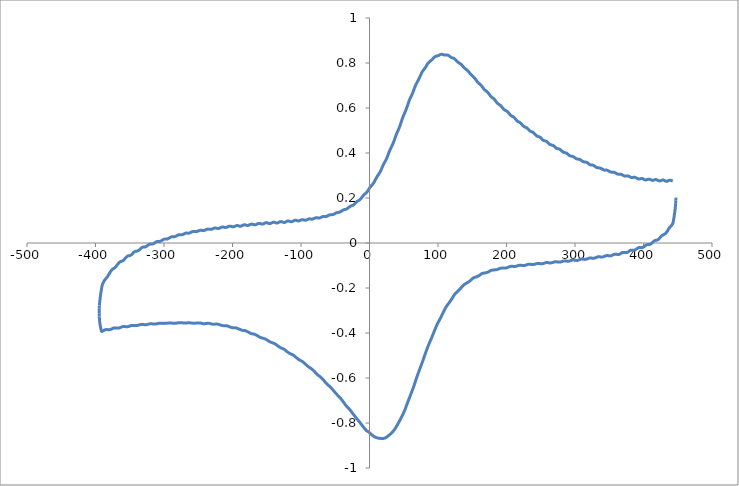
| Category | Series 0 |
|---|---|
| 447.34 | 0.202 |
| 447.227 | 0.19 |
| 446.985 | 0.177 |
| 446.617 | 0.164 |
| 446.124 | 0.149 |
| 445.51 | 0.134 |
| 444.775 | 0.119 |
| 443.91 | 0.103 |
| 442.919 | 0.088 |
| 441.921 | 0.083 |
| 440.919 | 0.078 |
| 439.921 | 0.075 |
| 438.925 | 0.072 |
| 437.928 | 0.068 |
| 436.932 | 0.064 |
| 435.936 | 0.059 |
| 434.937 | 0.053 |
| 433.939 | 0.049 |
| 432.935 | 0.045 |
| 431.941 | 0.042 |
| 430.941 | 0.04 |
| 429.939 | 0.038 |
| 428.935 | 0.036 |
| 427.933 | 0.035 |
| 426.934 | 0.033 |
| 425.938 | 0.03 |
| 424.943 | 0.027 |
| 423.945 | 0.023 |
| 422.951 | 0.02 |
| 421.955 | 0.016 |
| 420.962 | 0.014 |
| 419.967 | 0.013 |
| 418.972 | 0.012 |
| 417.971 | 0.012 |
| 416.982 | 0.011 |
| 415.978 | 0.01 |
| 414.981 | 0.008 |
| 413.983 | 0.005 |
| 412.986 | 0.002 |
| 411.988 | -0.001 |
| 410.987 | -0.003 |
| 409.979 | -0.005 |
| 408.974 | -0.007 |
| 407.973 | -0.007 |
| 406.973 | -0.007 |
| 405.971 | -0.007 |
| 404.964 | -0.008 |
| 403.958 | -0.009 |
| 402.953 | -0.011 |
| 401.948 | -0.014 |
| 400.941 | -0.016 |
| 399.939 | -0.018 |
| 398.936 | -0.02 |
| 397.931 | -0.021 |
| 396.926 | -0.021 |
| 395.919 | -0.02 |
| 394.92 | -0.02 |
| 393.923 | -0.02 |
| 392.926 | -0.021 |
| 391.928 | -0.022 |
| 390.924 | -0.024 |
| 389.92 | -0.026 |
| 388.919 | -0.029 |
| 387.92 | -0.03 |
| 386.922 | -0.031 |
| 385.919 | -0.032 |
| 384.92 | -0.032 |
| 383.92 | -0.032 |
| 382.92 | -0.032 |
| 381.924 | -0.032 |
| 380.929 | -0.033 |
| 379.932 | -0.034 |
| 378.931 | -0.037 |
| 377.925 | -0.039 |
| 376.919 | -0.041 |
| 375.916 | -0.042 |
| 374.918 | -0.043 |
| 373.915 | -0.043 |
| 372.914 | -0.043 |
| 371.916 | -0.042 |
| 370.913 | -0.042 |
| 369.916 | -0.042 |
| 368.921 | -0.043 |
| 367.925 | -0.045 |
| 366.927 | -0.047 |
| 365.923 | -0.048 |
| 364.921 | -0.05 |
| 363.918 | -0.051 |
| 362.916 | -0.051 |
| 361.917 | -0.051 |
| 360.915 | -0.05 |
| 359.912 | -0.05 |
| 358.906 | -0.05 |
| 357.906 | -0.05 |
| 356.903 | -0.051 |
| 355.897 | -0.052 |
| 354.897 | -0.054 |
| 353.896 | -0.055 |
| 352.886 | -0.057 |
| 351.881 | -0.057 |
| 350.876 | -0.057 |
| 349.88 | -0.057 |
| 348.88 | -0.056 |
| 347.878 | -0.056 |
| 346.876 | -0.056 |
| 345.876 | -0.056 |
| 344.881 | -0.057 |
| 343.881 | -0.058 |
| 342.886 | -0.059 |
| 341.889 | -0.061 |
| 340.892 | -0.062 |
| 339.893 | -0.063 |
| 338.893 | -0.063 |
| 337.892 | -0.062 |
| 336.894 | -0.062 |
| 335.896 | -0.061 |
| 334.896 | -0.061 |
| 333.891 | -0.061 |
| 332.887 | -0.062 |
| 331.888 | -0.063 |
| 330.89 | -0.064 |
| 329.893 | -0.065 |
| 328.891 | -0.067 |
| 327.894 | -0.067 |
| 326.892 | -0.068 |
| 325.889 | -0.068 |
| 324.892 | -0.067 |
| 323.891 | -0.067 |
| 322.896 | -0.066 |
| 321.897 | -0.067 |
| 320.898 | -0.067 |
| 319.9 | -0.068 |
| 318.902 | -0.069 |
| 317.91 | -0.07 |
| 316.916 | -0.072 |
| 315.919 | -0.072 |
| 314.917 | -0.073 |
| 313.913 | -0.073 |
| 312.909 | -0.073 |
| 311.908 | -0.072 |
| 310.903 | -0.072 |
| 309.903 | -0.072 |
| 308.899 | -0.072 |
| 307.897 | -0.073 |
| 306.893 | -0.074 |
| 305.89 | -0.075 |
| 304.888 | -0.076 |
| 303.883 | -0.077 |
| 302.879 | -0.078 |
| 301.869 | -0.078 |
| 300.858 | -0.077 |
| 299.852 | -0.077 |
| 298.854 | -0.076 |
| 297.853 | -0.076 |
| 296.854 | -0.076 |
| 295.85 | -0.076 |
| 294.853 | -0.077 |
| 293.854 | -0.078 |
| 292.857 | -0.079 |
| 291.86 | -0.08 |
| 290.857 | -0.081 |
| 289.862 | -0.081 |
| 288.863 | -0.081 |
| 287.863 | -0.081 |
| 286.865 | -0.08 |
| 285.867 | -0.08 |
| 284.869 | -0.08 |
| 283.876 | -0.08 |
| 282.873 | -0.081 |
| 281.873 | -0.082 |
| 280.872 | -0.083 |
| 279.872 | -0.083 |
| 278.873 | -0.084 |
| 277.875 | -0.085 |
| 276.873 | -0.085 |
| 275.867 | -0.085 |
| 274.865 | -0.085 |
| 273.86 | -0.084 |
| 272.859 | -0.083 |
| 271.857 | -0.083 |
| 270.856 | -0.083 |
| 269.861 | -0.084 |
| 268.864 | -0.085 |
| 267.863 | -0.086 |
| 266.87 | -0.087 |
| 265.874 | -0.088 |
| 264.875 | -0.088 |
| 263.878 | -0.089 |
| 262.873 | -0.088 |
| 261.872 | -0.088 |
| 260.871 | -0.088 |
| 259.877 | -0.087 |
| 258.877 | -0.087 |
| 257.88 | -0.087 |
| 256.879 | -0.088 |
| 255.882 | -0.089 |
| 254.882 | -0.09 |
| 253.881 | -0.091 |
| 252.881 | -0.092 |
| 251.875 | -0.092 |
| 250.87 | -0.092 |
| 249.869 | -0.092 |
| 248.867 | -0.092 |
| 247.865 | -0.091 |
| 246.868 | -0.091 |
| 245.87 | -0.091 |
| 244.872 | -0.091 |
| 243.869 | -0.092 |
| 242.869 | -0.093 |
| 241.866 | -0.094 |
| 240.872 | -0.095 |
| 239.874 | -0.095 |
| 238.876 | -0.096 |
| 237.875 | -0.096 |
| 236.877 | -0.096 |
| 235.878 | -0.095 |
| 234.88 | -0.095 |
| 233.881 | -0.094 |
| 232.885 | -0.094 |
| 231.886 | -0.095 |
| 230.887 | -0.095 |
| 229.886 | -0.096 |
| 228.891 | -0.097 |
| 227.892 | -0.099 |
| 226.896 | -0.099 |
| 225.9 | -0.1 |
| 224.896 | -0.1 |
| 223.892 | -0.1 |
| 222.891 | -0.1 |
| 221.897 | -0.099 |
| 220.901 | -0.099 |
| 219.904 | -0.099 |
| 218.903 | -0.099 |
| 217.904 | -0.1 |
| 216.907 | -0.1 |
| 215.917 | -0.101 |
| 214.924 | -0.102 |
| 213.928 | -0.103 |
| 212.926 | -0.104 |
| 211.93 | -0.104 |
| 210.932 | -0.104 |
| 209.933 | -0.104 |
| 208.935 | -0.104 |
| 207.939 | -0.104 |
| 206.939 | -0.104 |
| 205.934 | -0.104 |
| 204.933 | -0.105 |
| 203.935 | -0.106 |
| 202.934 | -0.107 |
| 201.934 | -0.108 |
| 200.934 | -0.11 |
| 199.927 | -0.111 |
| 198.916 | -0.111 |
| 197.914 | -0.112 |
| 196.911 | -0.112 |
| 195.911 | -0.111 |
| 194.908 | -0.111 |
| 193.901 | -0.111 |
| 192.897 | -0.112 |
| 191.897 | -0.112 |
| 190.899 | -0.113 |
| 189.9 | -0.113 |
| 188.897 | -0.114 |
| 187.897 | -0.116 |
| 186.9 | -0.117 |
| 185.895 | -0.118 |
| 184.892 | -0.118 |
| 183.891 | -0.119 |
| 182.898 | -0.119 |
| 181.896 | -0.12 |
| 180.897 | -0.12 |
| 179.892 | -0.12 |
| 178.889 | -0.121 |
| 177.893 | -0.122 |
| 176.893 | -0.123 |
| 175.892 | -0.124 |
| 174.887 | -0.126 |
| 173.884 | -0.128 |
| 172.883 | -0.129 |
| 171.882 | -0.131 |
| 170.883 | -0.132 |
| 169.883 | -0.132 |
| 168.883 | -0.133 |
| 167.88 | -0.133 |
| 166.881 | -0.134 |
| 165.881 | -0.134 |
| 164.88 | -0.135 |
| 163.886 | -0.136 |
| 162.89 | -0.138 |
| 161.892 | -0.141 |
| 160.894 | -0.143 |
| 159.891 | -0.145 |
| 158.891 | -0.147 |
| 157.89 | -0.148 |
| 156.894 | -0.149 |
| 155.89 | -0.151 |
| 154.885 | -0.151 |
| 153.884 | -0.153 |
| 152.883 | -0.154 |
| 151.887 | -0.155 |
| 150.883 | -0.157 |
| 149.881 | -0.159 |
| 148.88 | -0.162 |
| 147.874 | -0.165 |
| 146.871 | -0.168 |
| 145.867 | -0.17 |
| 144.865 | -0.173 |
| 143.868 | -0.175 |
| 142.871 | -0.176 |
| 141.87 | -0.178 |
| 140.869 | -0.18 |
| 139.869 | -0.182 |
| 138.872 | -0.183 |
| 137.875 | -0.186 |
| 136.881 | -0.188 |
| 135.884 | -0.192 |
| 134.888 | -0.195 |
| 133.89 | -0.199 |
| 132.89 | -0.202 |
| 131.892 | -0.205 |
| 130.895 | -0.209 |
| 129.895 | -0.212 |
| 128.896 | -0.214 |
| 127.895 | -0.217 |
| 126.897 | -0.22 |
| 125.906 | -0.223 |
| 124.906 | -0.226 |
| 123.907 | -0.23 |
| 122.909 | -0.235 |
| 121.91 | -0.24 |
| 120.905 | -0.245 |
| 119.902 | -0.249 |
| 118.903 | -0.254 |
| 117.902 | -0.259 |
| 116.904 | -0.263 |
| 115.912 | -0.267 |
| 114.916 | -0.271 |
| 113.919 | -0.275 |
| 112.92 | -0.279 |
| 111.926 | -0.284 |
| 110.925 | -0.289 |
| 109.92 | -0.295 |
| 108.916 | -0.301 |
| 107.916 | -0.307 |
| 106.918 | -0.313 |
| 105.914 | -0.319 |
| 104.915 | -0.326 |
| 103.911 | -0.332 |
| 102.907 | -0.338 |
| 101.907 | -0.344 |
| 100.905 | -0.349 |
| 99.895 | -0.355 |
| 98.894 | -0.361 |
| 97.888 | -0.368 |
| 96.886 | -0.375 |
| 95.881 | -0.382 |
| 94.878 | -0.39 |
| 93.875 | -0.397 |
| 92.873 | -0.405 |
| 91.869 | -0.412 |
| 90.864 | -0.42 |
| 89.86 | -0.427 |
| 88.862 | -0.434 |
| 87.861 | -0.441 |
| 86.863 | -0.449 |
| 85.868 | -0.456 |
| 84.87 | -0.464 |
| 83.871 | -0.472 |
| 82.87 | -0.48 |
| 81.874 | -0.488 |
| 80.875 | -0.497 |
| 79.872 | -0.506 |
| 78.871 | -0.515 |
| 77.872 | -0.523 |
| 76.871 | -0.532 |
| 75.873 | -0.54 |
| 74.875 | -0.548 |
| 73.882 | -0.556 |
| 72.88 | -0.564 |
| 71.881 | -0.573 |
| 70.878 | -0.581 |
| 69.875 | -0.59 |
| 68.874 | -0.598 |
| 67.872 | -0.607 |
| 66.871 | -0.617 |
| 65.868 | -0.626 |
| 64.866 | -0.635 |
| 63.87 | -0.644 |
| 62.872 | -0.652 |
| 61.877 | -0.66 |
| 60.886 | -0.668 |
| 59.888 | -0.676 |
| 58.886 | -0.683 |
| 57.885 | -0.691 |
| 56.882 | -0.699 |
| 55.881 | -0.707 |
| 54.882 | -0.715 |
| 53.881 | -0.723 |
| 52.881 | -0.732 |
| 51.881 | -0.74 |
| 50.881 | -0.747 |
| 49.883 | -0.754 |
| 48.884 | -0.76 |
| 47.884 | -0.767 |
| 46.884 | -0.773 |
| 45.879 | -0.779 |
| 44.873 | -0.785 |
| 43.874 | -0.791 |
| 42.873 | -0.796 |
| 41.873 | -0.802 |
| 40.872 | -0.807 |
| 39.871 | -0.813 |
| 38.87 | -0.818 |
| 37.871 | -0.823 |
| 36.874 | -0.827 |
| 35.881 | -0.831 |
| 34.887 | -0.835 |
| 33.889 | -0.839 |
| 32.893 | -0.843 |
| 31.891 | -0.846 |
| 30.894 | -0.848 |
| 29.898 | -0.851 |
| 28.901 | -0.853 |
| 27.902 | -0.855 |
| 26.906 | -0.858 |
| 25.909 | -0.861 |
| 24.915 | -0.863 |
| 23.916 | -0.865 |
| 22.919 | -0.866 |
| 21.921 | -0.867 |
| 20.918 | -0.868 |
| 19.914 | -0.869 |
| 18.911 | -0.869 |
| 17.914 | -0.869 |
| 16.913 | -0.869 |
| 15.917 | -0.869 |
| 14.919 | -0.868 |
| 13.922 | -0.868 |
| 12.924 | -0.867 |
| 11.929 | -0.867 |
| 10.932 | -0.866 |
| 9.938 | -0.865 |
| 8.948 | -0.864 |
| 7.96 | -0.862 |
| 6.968 | -0.861 |
| 5.972 | -0.859 |
| 4.98 | -0.856 |
| 3.989 | -0.854 |
| 2.997 | -0.851 |
| 1.998 | -0.848 |
| 1.005 | -0.846 |
| 0.009 | -0.843 |
| -0.99 | -0.841 |
| -1.983 | -0.839 |
| -2.979 | -0.836 |
| -3.977 | -0.835 |
| -4.978 | -0.832 |
| -5.983 | -0.829 |
| -6.987 | -0.825 |
| -7.994 | -0.821 |
| -8.995 | -0.818 |
| -9.997 | -0.814 |
| -10.999 | -0.81 |
| -12.008 | -0.806 |
| -13.008 | -0.802 |
| -14.009 | -0.798 |
| -15.007 | -0.794 |
| -16.008 | -0.79 |
| -17.007 | -0.787 |
| -18.015 | -0.783 |
| -19.016 | -0.779 |
| -20.02 | -0.775 |
| -21.019 | -0.771 |
| -22.012 | -0.767 |
| -23.013 | -0.764 |
| -24.008 | -0.76 |
| -25.008 | -0.756 |
| -26.009 | -0.751 |
| -27.005 | -0.747 |
| -27.998 | -0.744 |
| -28.999 | -0.74 |
| -29.999 | -0.737 |
| -31.004 | -0.734 |
| -32.004 | -0.73 |
| -33.006 | -0.727 |
| -34.004 | -0.723 |
| -35.002 | -0.72 |
| -36.003 | -0.715 |
| -37.004 | -0.711 |
| -38.008 | -0.707 |
| -39.011 | -0.703 |
| -40.013 | -0.699 |
| -41.011 | -0.695 |
| -42.006 | -0.691 |
| -43.008 | -0.688 |
| -44.01 | -0.685 |
| -45.013 | -0.681 |
| -46.018 | -0.678 |
| -47.02 | -0.675 |
| -48.02 | -0.672 |
| -49.02 | -0.668 |
| -50.02 | -0.665 |
| -51.026 | -0.662 |
| -52.029 | -0.658 |
| -53.027 | -0.654 |
| -54.027 | -0.65 |
| -55.027 | -0.647 |
| -56.033 | -0.644 |
| -57.041 | -0.641 |
| -58.048 | -0.638 |
| -59.049 | -0.635 |
| -60.053 | -0.632 |
| -61.054 | -0.63 |
| -62.052 | -0.627 |
| -63.051 | -0.624 |
| -64.057 | -0.621 |
| -65.057 | -0.617 |
| -66.054 | -0.613 |
| -67.047 | -0.609 |
| -68.043 | -0.606 |
| -69.044 | -0.603 |
| -70.044 | -0.6 |
| -71.044 | -0.597 |
| -72.04 | -0.595 |
| -73.037 | -0.592 |
| -74.03 | -0.59 |
| -75.034 | -0.588 |
| -76.033 | -0.585 |
| -77.034 | -0.582 |
| -78.03 | -0.579 |
| -79.028 | -0.576 |
| -80.024 | -0.572 |
| -81.022 | -0.569 |
| -82.027 | -0.566 |
| -83.031 | -0.564 |
| -84.032 | -0.561 |
| -85.034 | -0.558 |
| -86.035 | -0.556 |
| -87.032 | -0.554 |
| -88.033 | -0.553 |
| -89.028 | -0.55 |
| -90.029 | -0.548 |
| -91.022 | -0.545 |
| -92.015 | -0.542 |
| -93.01 | -0.54 |
| -94.009 | -0.537 |
| -95.009 | -0.534 |
| -96.01 | -0.532 |
| -97.01 | -0.529 |
| -98.014 | -0.527 |
| -99.013 | -0.525 |
| -100.016 | -0.523 |
| -101.02 | -0.522 |
| -102.023 | -0.52 |
| -103.028 | -0.518 |
| -104.033 | -0.516 |
| -105.041 | -0.513 |
| -106.046 | -0.511 |
| -107.057 | -0.509 |
| -108.067 | -0.506 |
| -109.075 | -0.503 |
| -110.085 | -0.501 |
| -111.086 | -0.499 |
| -112.088 | -0.497 |
| -113.089 | -0.495 |
| -114.091 | -0.494 |
| -115.094 | -0.493 |
| -116.096 | -0.491 |
| -117.095 | -0.49 |
| -118.088 | -0.488 |
| -119.087 | -0.486 |
| -120.085 | -0.483 |
| -121.083 | -0.481 |
| -122.084 | -0.479 |
| -123.079 | -0.476 |
| -124.076 | -0.474 |
| -125.075 | -0.472 |
| -126.072 | -0.47 |
| -127.072 | -0.469 |
| -128.068 | -0.468 |
| -129.066 | -0.466 |
| -130.061 | -0.465 |
| -131.06 | -0.463 |
| -132.058 | -0.461 |
| -133.057 | -0.459 |
| -134.066 | -0.457 |
| -135.068 | -0.454 |
| -136.066 | -0.452 |
| -137.066 | -0.45 |
| -138.062 | -0.448 |
| -139.065 | -0.446 |
| -140.066 | -0.445 |
| -141.066 | -0.444 |
| -142.067 | -0.443 |
| -143.066 | -0.442 |
| -144.066 | -0.441 |
| -145.069 | -0.44 |
| -146.072 | -0.438 |
| -147.073 | -0.436 |
| -148.073 | -0.434 |
| -149.076 | -0.432 |
| -150.068 | -0.43 |
| -151.066 | -0.428 |
| -152.07 | -0.427 |
| -153.072 | -0.426 |
| -154.072 | -0.425 |
| -155.071 | -0.424 |
| -156.07 | -0.423 |
| -157.07 | -0.422 |
| -158.07 | -0.421 |
| -159.073 | -0.42 |
| -160.079 | -0.419 |
| -161.082 | -0.417 |
| -162.081 | -0.415 |
| -163.077 | -0.413 |
| -164.076 | -0.411 |
| -165.074 | -0.409 |
| -166.077 | -0.408 |
| -167.076 | -0.407 |
| -168.071 | -0.406 |
| -169.069 | -0.405 |
| -170.069 | -0.404 |
| -171.068 | -0.404 |
| -172.067 | -0.403 |
| -173.068 | -0.402 |
| -174.065 | -0.401 |
| -175.059 | -0.399 |
| -176.056 | -0.397 |
| -177.052 | -0.396 |
| -178.051 | -0.394 |
| -179.052 | -0.393 |
| -180.049 | -0.391 |
| -181.044 | -0.39 |
| -182.039 | -0.389 |
| -183.034 | -0.389 |
| -184.037 | -0.389 |
| -185.04 | -0.388 |
| -186.04 | -0.388 |
| -187.041 | -0.387 |
| -188.04 | -0.385 |
| -189.038 | -0.384 |
| -190.037 | -0.383 |
| -191.039 | -0.382 |
| -192.035 | -0.38 |
| -193.029 | -0.379 |
| -194.026 | -0.378 |
| -195.022 | -0.377 |
| -196.021 | -0.377 |
| -197.022 | -0.377 |
| -198.023 | -0.377 |
| -199.027 | -0.377 |
| -200.026 | -0.376 |
| -201.022 | -0.376 |
| -202.019 | -0.375 |
| -203.019 | -0.374 |
| -204.021 | -0.373 |
| -205.019 | -0.371 |
| -206.02 | -0.37 |
| -207.02 | -0.369 |
| -208.02 | -0.368 |
| -209.028 | -0.368 |
| -210.029 | -0.368 |
| -211.036 | -0.368 |
| -212.04 | -0.368 |
| -213.045 | -0.368 |
| -214.046 | -0.367 |
| -215.048 | -0.367 |
| -216.05 | -0.366 |
| -217.052 | -0.365 |
| -218.053 | -0.364 |
| -219.051 | -0.363 |
| -220.052 | -0.362 |
| -221.051 | -0.361 |
| -222.054 | -0.361 |
| -223.056 | -0.36 |
| -224.06 | -0.36 |
| -225.06 | -0.361 |
| -226.062 | -0.361 |
| -227.06 | -0.361 |
| -228.061 | -0.361 |
| -229.058 | -0.361 |
| -230.06 | -0.36 |
| -231.062 | -0.36 |
| -232.061 | -0.359 |
| -233.055 | -0.358 |
| -234.057 | -0.357 |
| -235.058 | -0.357 |
| -236.058 | -0.357 |
| -237.06 | -0.357 |
| -238.059 | -0.358 |
| -239.06 | -0.358 |
| -240.059 | -0.359 |
| -241.059 | -0.359 |
| -242.057 | -0.359 |
| -243.059 | -0.359 |
| -244.058 | -0.358 |
| -245.055 | -0.357 |
| -246.051 | -0.356 |
| -247.049 | -0.356 |
| -248.047 | -0.355 |
| -249.053 | -0.355 |
| -250.054 | -0.355 |
| -251.054 | -0.355 |
| -252.054 | -0.356 |
| -253.057 | -0.356 |
| -254.059 | -0.356 |
| -255.062 | -0.357 |
| -256.062 | -0.357 |
| -257.062 | -0.357 |
| -258.062 | -0.356 |
| -259.06 | -0.356 |
| -260.062 | -0.355 |
| -261.068 | -0.355 |
| -262.075 | -0.355 |
| -263.079 | -0.355 |
| -264.085 | -0.354 |
| -265.084 | -0.355 |
| -266.089 | -0.355 |
| -267.09 | -0.355 |
| -268.091 | -0.356 |
| -269.088 | -0.356 |
| -270.085 | -0.356 |
| -271.078 | -0.355 |
| -272.074 | -0.355 |
| -273.072 | -0.355 |
| -274.073 | -0.355 |
| -275.074 | -0.355 |
| -276.074 | -0.354 |
| -277.069 | -0.354 |
| -278.064 | -0.354 |
| -279.058 | -0.355 |
| -280.053 | -0.355 |
| -281.055 | -0.356 |
| -282.049 | -0.356 |
| -283.048 | -0.357 |
| -284.045 | -0.356 |
| -285.042 | -0.356 |
| -286.039 | -0.356 |
| -287.043 | -0.357 |
| -288.042 | -0.356 |
| -289.039 | -0.356 |
| -290.035 | -0.355 |
| -291.029 | -0.355 |
| -292.021 | -0.355 |
| -293.017 | -0.355 |
| -294.021 | -0.356 |
| -295.018 | -0.356 |
| -296.016 | -0.356 |
| -297.005 | -0.357 |
| -298.005 | -0.357 |
| -299.002 | -0.357 |
| -300.004 | -0.357 |
| -301.012 | -0.357 |
| -302.012 | -0.357 |
| -303.013 | -0.357 |
| -304.018 | -0.356 |
| -305.025 | -0.356 |
| -306.029 | -0.357 |
| -307.038 | -0.357 |
| -308.045 | -0.357 |
| -309.05 | -0.358 |
| -310.049 | -0.359 |
| -311.055 | -0.36 |
| -312.061 | -0.36 |
| -313.075 | -0.36 |
| -314.081 | -0.36 |
| -315.087 | -0.36 |
| -316.088 | -0.36 |
| -317.085 | -0.359 |
| -318.09 | -0.359 |
| -319.092 | -0.359 |
| -320.092 | -0.359 |
| -321.089 | -0.36 |
| -322.09 | -0.36 |
| -323.085 | -0.361 |
| -324.084 | -0.362 |
| -325.086 | -0.363 |
| -326.083 | -0.363 |
| -327.081 | -0.363 |
| -328.078 | -0.363 |
| -329.072 | -0.363 |
| -330.068 | -0.363 |
| -331.066 | -0.363 |
| -332.067 | -0.362 |
| -333.068 | -0.362 |
| -334.063 | -0.363 |
| -335.06 | -0.363 |
| -336.06 | -0.364 |
| -337.062 | -0.365 |
| -338.06 | -0.366 |
| -339.062 | -0.367 |
| -340.065 | -0.367 |
| -341.062 | -0.367 |
| -342.068 | -0.367 |
| -343.069 | -0.367 |
| -344.072 | -0.366 |
| -345.07 | -0.366 |
| -346.067 | -0.366 |
| -347.067 | -0.367 |
| -348.062 | -0.367 |
| -349.058 | -0.368 |
| -350.058 | -0.369 |
| -351.062 | -0.371 |
| -352.059 | -0.371 |
| -353.06 | -0.372 |
| -354.062 | -0.372 |
| -355.065 | -0.372 |
| -356.065 | -0.372 |
| -357.068 | -0.371 |
| -358.067 | -0.371 |
| -359.066 | -0.371 |
| -360.066 | -0.372 |
| -361.066 | -0.372 |
| -362.073 | -0.373 |
| -363.075 | -0.375 |
| -364.077 | -0.376 |
| -365.083 | -0.377 |
| -366.087 | -0.378 |
| -367.086 | -0.378 |
| -368.086 | -0.378 |
| -369.081 | -0.378 |
| -370.081 | -0.378 |
| -371.079 | -0.377 |
| -372.075 | -0.377 |
| -373.074 | -0.378 |
| -374.07 | -0.378 |
| -375.068 | -0.38 |
| -376.064 | -0.382 |
| -377.065 | -0.383 |
| -378.059 | -0.384 |
| -379.058 | -0.385 |
| -380.056 | -0.385 |
| -381.05 | -0.385 |
| -382.046 | -0.385 |
| -383.043 | -0.385 |
| -384.044 | -0.385 |
| -385.043 | -0.385 |
| -386.04 | -0.386 |
| -387.037 | -0.387 |
| -388.037 | -0.389 |
| -389.036 | -0.391 |
| -390.038 | -0.392 |
| -391.041 | -0.393 |
| -391.926 | -0.384 |
| -392.684 | -0.374 |
| -393.321 | -0.363 |
| -393.826 | -0.351 |
| -394.213 | -0.339 |
| -394.479 | -0.326 |
| -394.616 | -0.314 |
| -394.625 | -0.302 |
| -394.511 | -0.29 |
| -394.273 | -0.278 |
| -393.913 | -0.265 |
| -393.428 | -0.251 |
| -392.812 | -0.236 |
| -392.071 | -0.22 |
| -391.208 | -0.204 |
| -390.216 | -0.187 |
| -389.216 | -0.179 |
| -388.216 | -0.173 |
| -387.216 | -0.168 |
| -386.221 | -0.163 |
| -385.224 | -0.16 |
| -384.222 | -0.156 |
| -383.221 | -0.152 |
| -382.222 | -0.148 |
| -381.226 | -0.143 |
| -380.223 | -0.138 |
| -379.222 | -0.133 |
| -378.226 | -0.128 |
| -377.226 | -0.124 |
| -376.224 | -0.12 |
| -375.226 | -0.117 |
| -374.229 | -0.115 |
| -373.229 | -0.113 |
| -372.237 | -0.111 |
| -371.238 | -0.108 |
| -370.235 | -0.105 |
| -369.231 | -0.101 |
| -368.232 | -0.097 |
| -367.232 | -0.093 |
| -366.236 | -0.089 |
| -365.234 | -0.086 |
| -364.234 | -0.084 |
| -363.231 | -0.082 |
| -362.225 | -0.081 |
| -361.225 | -0.08 |
| -360.228 | -0.079 |
| -359.228 | -0.077 |
| -358.23 | -0.074 |
| -357.231 | -0.07 |
| -356.227 | -0.066 |
| -355.226 | -0.063 |
| -354.226 | -0.061 |
| -353.228 | -0.059 |
| -352.228 | -0.057 |
| -351.228 | -0.057 |
| -350.226 | -0.056 |
| -349.227 | -0.055 |
| -348.231 | -0.054 |
| -347.235 | -0.052 |
| -346.235 | -0.048 |
| -345.236 | -0.045 |
| -344.237 | -0.042 |
| -343.235 | -0.039 |
| -342.231 | -0.038 |
| -341.228 | -0.037 |
| -340.229 | -0.036 |
| -339.228 | -0.036 |
| -338.228 | -0.035 |
| -337.226 | -0.033 |
| -336.226 | -0.031 |
| -335.225 | -0.028 |
| -334.226 | -0.025 |
| -333.228 | -0.023 |
| -332.231 | -0.02 |
| -331.231 | -0.019 |
| -330.236 | -0.018 |
| -329.239 | -0.018 |
| -328.242 | -0.018 |
| -327.245 | -0.017 |
| -326.247 | -0.016 |
| -325.246 | -0.014 |
| -324.248 | -0.012 |
| -323.25 | -0.009 |
| -322.254 | -0.007 |
| -321.259 | -0.006 |
| -320.258 | -0.005 |
| -319.26 | -0.005 |
| -318.258 | -0.005 |
| -317.255 | -0.005 |
| -316.252 | -0.004 |
| -315.249 | -0.003 |
| -314.245 | -0.001 |
| -313.238 | 0.001 |
| -312.229 | 0.004 |
| -311.221 | 0.005 |
| -310.217 | 0.006 |
| -309.219 | 0.007 |
| -308.213 | 0.007 |
| -307.21 | 0.007 |
| -306.205 | 0.007 |
| -305.202 | 0.008 |
| -304.202 | 0.009 |
| -303.2 | 0.011 |
| -302.197 | 0.013 |
| -301.197 | 0.015 |
| -300.194 | 0.016 |
| -299.191 | 0.017 |
| -298.191 | 0.018 |
| -297.197 | 0.018 |
| -296.202 | 0.017 |
| -295.206 | 0.018 |
| -294.21 | 0.019 |
| -293.208 | 0.021 |
| -292.211 | 0.023 |
| -291.211 | 0.024 |
| -290.215 | 0.026 |
| -289.216 | 0.027 |
| -288.213 | 0.028 |
| -287.209 | 0.028 |
| -286.21 | 0.028 |
| -285.209 | 0.028 |
| -284.208 | 0.028 |
| -283.212 | 0.029 |
| -282.216 | 0.031 |
| -281.216 | 0.033 |
| -280.216 | 0.034 |
| -279.218 | 0.036 |
| -278.219 | 0.036 |
| -277.221 | 0.037 |
| -276.221 | 0.036 |
| -275.221 | 0.036 |
| -274.217 | 0.037 |
| -273.217 | 0.037 |
| -272.221 | 0.038 |
| -271.228 | 0.04 |
| -270.231 | 0.041 |
| -269.234 | 0.043 |
| -268.239 | 0.044 |
| -267.241 | 0.044 |
| -266.24 | 0.044 |
| -265.237 | 0.044 |
| -264.238 | 0.044 |
| -263.238 | 0.044 |
| -262.234 | 0.045 |
| -261.229 | 0.046 |
| -260.226 | 0.048 |
| -259.222 | 0.05 |
| -258.218 | 0.05 |
| -257.217 | 0.051 |
| -256.214 | 0.051 |
| -255.208 | 0.051 |
| -254.205 | 0.051 |
| -253.202 | 0.05 |
| -252.2 | 0.051 |
| -251.196 | 0.052 |
| -250.192 | 0.053 |
| -249.19 | 0.054 |
| -248.185 | 0.056 |
| -247.184 | 0.056 |
| -246.185 | 0.056 |
| -245.193 | 0.056 |
| -244.2 | 0.056 |
| -243.202 | 0.055 |
| -242.207 | 0.055 |
| -241.208 | 0.056 |
| -240.211 | 0.057 |
| -239.213 | 0.059 |
| -238.215 | 0.06 |
| -237.215 | 0.061 |
| -236.212 | 0.062 |
| -235.209 | 0.062 |
| -234.211 | 0.061 |
| -233.214 | 0.061 |
| -232.221 | 0.061 |
| -231.223 | 0.061 |
| -230.222 | 0.061 |
| -229.22 | 0.062 |
| -228.216 | 0.064 |
| -227.22 | 0.065 |
| -226.221 | 0.066 |
| -225.222 | 0.066 |
| -224.219 | 0.066 |
| -223.216 | 0.066 |
| -222.216 | 0.065 |
| -221.219 | 0.065 |
| -220.222 | 0.065 |
| -219.225 | 0.066 |
| -218.222 | 0.067 |
| -217.22 | 0.068 |
| -216.215 | 0.07 |
| -215.208 | 0.071 |
| -214.208 | 0.071 |
| -213.205 | 0.071 |
| -212.203 | 0.07 |
| -211.2 | 0.069 |
| -210.191 | 0.069 |
| -209.183 | 0.069 |
| -208.182 | 0.07 |
| -207.182 | 0.072 |
| -206.176 | 0.073 |
| -205.17 | 0.074 |
| -204.167 | 0.075 |
| -203.164 | 0.075 |
| -202.166 | 0.074 |
| -201.169 | 0.073 |
| -200.169 | 0.072 |
| -199.173 | 0.072 |
| -198.173 | 0.072 |
| -197.175 | 0.073 |
| -196.17 | 0.075 |
| -195.172 | 0.076 |
| -194.175 | 0.077 |
| -193.18 | 0.078 |
| -192.183 | 0.077 |
| -191.185 | 0.076 |
| -190.193 | 0.075 |
| -189.197 | 0.075 |
| -188.201 | 0.075 |
| -187.204 | 0.075 |
| -186.201 | 0.077 |
| -185.2 | 0.078 |
| -184.202 | 0.08 |
| -183.202 | 0.081 |
| -182.202 | 0.081 |
| -181.208 | 0.08 |
| -180.212 | 0.079 |
| -179.213 | 0.078 |
| -178.218 | 0.078 |
| -177.219 | 0.078 |
| -176.22 | 0.079 |
| -175.222 | 0.081 |
| -174.218 | 0.082 |
| -173.221 | 0.083 |
| -172.218 | 0.084 |
| -171.216 | 0.084 |
| -170.221 | 0.083 |
| -169.219 | 0.082 |
| -168.22 | 0.081 |
| -167.223 | 0.081 |
| -166.225 | 0.081 |
| -165.221 | 0.083 |
| -164.22 | 0.084 |
| -163.218 | 0.086 |
| -162.217 | 0.087 |
| -161.218 | 0.087 |
| -160.211 | 0.087 |
| -159.209 | 0.086 |
| -158.207 | 0.085 |
| -157.204 | 0.084 |
| -156.206 | 0.084 |
| -155.206 | 0.085 |
| -154.202 | 0.086 |
| -153.203 | 0.088 |
| -152.201 | 0.089 |
| -151.201 | 0.09 |
| -150.199 | 0.09 |
| -149.198 | 0.089 |
| -148.203 | 0.088 |
| -147.204 | 0.087 |
| -146.201 | 0.086 |
| -145.198 | 0.086 |
| -144.204 | 0.087 |
| -143.204 | 0.089 |
| -142.207 | 0.09 |
| -141.208 | 0.092 |
| -140.207 | 0.093 |
| -139.208 | 0.092 |
| -138.214 | 0.091 |
| -137.212 | 0.09 |
| -136.214 | 0.089 |
| -135.214 | 0.089 |
| -134.214 | 0.089 |
| -133.214 | 0.091 |
| -132.214 | 0.092 |
| -131.212 | 0.094 |
| -130.214 | 0.095 |
| -129.219 | 0.095 |
| -128.219 | 0.095 |
| -127.223 | 0.094 |
| -126.225 | 0.092 |
| -125.23 | 0.092 |
| -124.234 | 0.091 |
| -123.238 | 0.092 |
| -122.236 | 0.094 |
| -121.24 | 0.095 |
| -120.24 | 0.097 |
| -119.236 | 0.098 |
| -118.235 | 0.098 |
| -117.233 | 0.097 |
| -116.233 | 0.096 |
| -115.236 | 0.095 |
| -114.236 | 0.095 |
| -113.235 | 0.095 |
| -112.232 | 0.096 |
| -111.231 | 0.098 |
| -110.229 | 0.1 |
| -109.224 | 0.101 |
| -108.217 | 0.101 |
| -107.207 | 0.101 |
| -106.202 | 0.1 |
| -105.194 | 0.099 |
| -104.191 | 0.098 |
| -103.189 | 0.098 |
| -102.187 | 0.099 |
| -101.187 | 0.101 |
| -100.185 | 0.102 |
| -99.18 | 0.103 |
| -98.176 | 0.103 |
| -97.176 | 0.103 |
| -96.173 | 0.103 |
| -95.168 | 0.102 |
| -94.163 | 0.101 |
| -93.16 | 0.102 |
| -92.161 | 0.102 |
| -91.171 | 0.104 |
| -90.173 | 0.105 |
| -89.175 | 0.106 |
| -88.177 | 0.107 |
| -87.18 | 0.107 |
| -86.181 | 0.107 |
| -85.182 | 0.106 |
| -84.181 | 0.106 |
| -83.182 | 0.106 |
| -82.181 | 0.107 |
| -81.175 | 0.109 |
| -80.175 | 0.11 |
| -79.18 | 0.111 |
| -78.185 | 0.112 |
| -77.188 | 0.112 |
| -76.189 | 0.112 |
| -75.187 | 0.111 |
| -74.189 | 0.111 |
| -73.19 | 0.111 |
| -72.194 | 0.112 |
| -71.195 | 0.113 |
| -70.198 | 0.115 |
| -69.2 | 0.116 |
| -68.199 | 0.117 |
| -67.2 | 0.118 |
| -66.206 | 0.117 |
| -65.215 | 0.117 |
| -64.217 | 0.117 |
| -63.213 | 0.118 |
| -62.211 | 0.119 |
| -61.211 | 0.12 |
| -60.212 | 0.122 |
| -59.209 | 0.124 |
| -58.207 | 0.125 |
| -57.206 | 0.126 |
| -56.199 | 0.126 |
| -55.194 | 0.126 |
| -54.194 | 0.126 |
| -53.193 | 0.127 |
| -52.193 | 0.128 |
| -51.192 | 0.129 |
| -50.187 | 0.131 |
| -49.183 | 0.133 |
| -48.182 | 0.134 |
| -47.186 | 0.135 |
| -46.185 | 0.136 |
| -45.184 | 0.136 |
| -44.183 | 0.137 |
| -43.188 | 0.138 |
| -42.187 | 0.139 |
| -41.187 | 0.141 |
| -40.19 | 0.143 |
| -39.197 | 0.145 |
| -38.196 | 0.147 |
| -37.194 | 0.148 |
| -36.193 | 0.149 |
| -35.193 | 0.149 |
| -34.199 | 0.15 |
| -33.198 | 0.152 |
| -32.197 | 0.153 |
| -31.192 | 0.156 |
| -30.192 | 0.159 |
| -29.192 | 0.161 |
| -28.19 | 0.163 |
| -27.187 | 0.164 |
| -26.188 | 0.165 |
| -25.192 | 0.167 |
| -24.192 | 0.168 |
| -23.186 | 0.17 |
| -22.187 | 0.172 |
| -21.187 | 0.175 |
| -20.192 | 0.179 |
| -19.192 | 0.182 |
| -18.186 | 0.184 |
| -17.184 | 0.186 |
| -16.185 | 0.188 |
| -15.187 | 0.19 |
| -14.19 | 0.192 |
| -13.187 | 0.195 |
| -12.185 | 0.199 |
| -11.18 | 0.203 |
| -10.178 | 0.207 |
| -9.175 | 0.21 |
| -8.173 | 0.214 |
| -7.172 | 0.217 |
| -6.164 | 0.22 |
| -5.163 | 0.222 |
| -4.157 | 0.225 |
| -3.154 | 0.229 |
| -2.153 | 0.233 |
| -1.154 | 0.238 |
| -0.152 | 0.243 |
| 0.847 | 0.248 |
| 1.851 | 0.252 |
| 2.848 | 0.255 |
| 3.845 | 0.259 |
| 4.839 | 0.262 |
| 5.834 | 0.266 |
| 6.834 | 0.271 |
| 7.834 | 0.277 |
| 8.829 | 0.283 |
| 9.82 | 0.288 |
| 10.814 | 0.294 |
| 11.812 | 0.298 |
| 12.807 | 0.303 |
| 13.801 | 0.307 |
| 14.797 | 0.312 |
| 15.792 | 0.318 |
| 16.79 | 0.324 |
| 17.786 | 0.331 |
| 18.782 | 0.338 |
| 19.783 | 0.345 |
| 20.784 | 0.352 |
| 21.785 | 0.357 |
| 22.782 | 0.362 |
| 23.773 | 0.368 |
| 24.771 | 0.374 |
| 25.769 | 0.381 |
| 26.771 | 0.389 |
| 27.765 | 0.397 |
| 28.76 | 0.405 |
| 29.757 | 0.412 |
| 30.755 | 0.419 |
| 31.749 | 0.425 |
| 32.747 | 0.432 |
| 33.746 | 0.438 |
| 34.746 | 0.445 |
| 35.74 | 0.453 |
| 36.736 | 0.462 |
| 37.733 | 0.471 |
| 38.729 | 0.479 |
| 39.731 | 0.487 |
| 40.73 | 0.494 |
| 41.731 | 0.5 |
| 42.728 | 0.507 |
| 43.73 | 0.515 |
| 44.732 | 0.523 |
| 45.738 | 0.532 |
| 46.743 | 0.542 |
| 47.75 | 0.551 |
| 48.754 | 0.559 |
| 49.753 | 0.567 |
| 50.751 | 0.574 |
| 51.751 | 0.581 |
| 52.752 | 0.588 |
| 53.753 | 0.596 |
| 54.754 | 0.604 |
| 55.754 | 0.613 |
| 56.753 | 0.623 |
| 57.752 | 0.631 |
| 58.753 | 0.639 |
| 59.754 | 0.645 |
| 60.75 | 0.651 |
| 61.744 | 0.658 |
| 62.738 | 0.665 |
| 63.731 | 0.673 |
| 64.727 | 0.681 |
| 65.726 | 0.689 |
| 66.726 | 0.697 |
| 67.725 | 0.704 |
| 68.723 | 0.71 |
| 69.72 | 0.715 |
| 70.717 | 0.721 |
| 71.72 | 0.727 |
| 72.719 | 0.733 |
| 73.717 | 0.74 |
| 74.713 | 0.747 |
| 75.711 | 0.753 |
| 76.713 | 0.759 |
| 77.715 | 0.764 |
| 78.72 | 0.769 |
| 79.719 | 0.772 |
| 80.713 | 0.776 |
| 81.708 | 0.781 |
| 82.706 | 0.785 |
| 83.71 | 0.791 |
| 84.714 | 0.796 |
| 85.719 | 0.8 |
| 86.719 | 0.803 |
| 87.718 | 0.806 |
| 88.713 | 0.808 |
| 89.713 | 0.811 |
| 90.713 | 0.813 |
| 91.715 | 0.816 |
| 92.718 | 0.82 |
| 93.717 | 0.823 |
| 94.714 | 0.826 |
| 95.719 | 0.828 |
| 96.728 | 0.83 |
| 97.738 | 0.831 |
| 98.742 | 0.831 |
| 99.742 | 0.832 |
| 100.744 | 0.833 |
| 101.745 | 0.835 |
| 102.751 | 0.837 |
| 103.754 | 0.838 |
| 104.762 | 0.839 |
| 105.767 | 0.839 |
| 106.767 | 0.838 |
| 107.77 | 0.837 |
| 108.77 | 0.836 |
| 109.772 | 0.836 |
| 110.773 | 0.836 |
| 111.77 | 0.836 |
| 112.768 | 0.836 |
| 113.76 | 0.835 |
| 114.761 | 0.834 |
| 115.757 | 0.832 |
| 116.755 | 0.83 |
| 117.747 | 0.828 |
| 118.743 | 0.826 |
| 119.74 | 0.824 |
| 120.736 | 0.823 |
| 121.736 | 0.822 |
| 122.739 | 0.821 |
| 123.736 | 0.819 |
| 124.736 | 0.817 |
| 125.733 | 0.814 |
| 126.731 | 0.811 |
| 127.729 | 0.808 |
| 128.727 | 0.805 |
| 129.728 | 0.802 |
| 130.724 | 0.8 |
| 131.72 | 0.799 |
| 132.719 | 0.796 |
| 133.722 | 0.794 |
| 134.724 | 0.791 |
| 135.724 | 0.787 |
| 136.725 | 0.784 |
| 137.721 | 0.78 |
| 138.715 | 0.777 |
| 139.711 | 0.775 |
| 140.711 | 0.773 |
| 141.711 | 0.771 |
| 142.713 | 0.768 |
| 143.717 | 0.765 |
| 144.717 | 0.761 |
| 145.717 | 0.757 |
| 146.721 | 0.753 |
| 147.729 | 0.75 |
| 148.733 | 0.747 |
| 149.737 | 0.744 |
| 150.737 | 0.741 |
| 151.737 | 0.739 |
| 152.74 | 0.735 |
| 153.746 | 0.732 |
| 154.749 | 0.728 |
| 155.751 | 0.724 |
| 156.751 | 0.719 |
| 157.752 | 0.715 |
| 158.754 | 0.712 |
| 159.751 | 0.71 |
| 160.754 | 0.707 |
| 161.756 | 0.705 |
| 162.753 | 0.701 |
| 163.751 | 0.697 |
| 164.745 | 0.693 |
| 165.741 | 0.689 |
| 166.739 | 0.685 |
| 167.74 | 0.682 |
| 168.741 | 0.679 |
| 169.739 | 0.677 |
| 170.74 | 0.674 |
| 171.741 | 0.672 |
| 172.743 | 0.669 |
| 173.745 | 0.665 |
| 174.742 | 0.661 |
| 175.742 | 0.657 |
| 176.742 | 0.653 |
| 177.741 | 0.65 |
| 178.742 | 0.647 |
| 179.738 | 0.645 |
| 180.739 | 0.643 |
| 181.741 | 0.64 |
| 182.742 | 0.637 |
| 183.738 | 0.633 |
| 184.735 | 0.629 |
| 185.737 | 0.625 |
| 186.739 | 0.621 |
| 187.74 | 0.619 |
| 188.738 | 0.616 |
| 189.739 | 0.614 |
| 190.738 | 0.612 |
| 191.742 | 0.61 |
| 192.741 | 0.606 |
| 193.741 | 0.603 |
| 194.743 | 0.599 |
| 195.747 | 0.595 |
| 196.752 | 0.593 |
| 197.755 | 0.59 |
| 198.76 | 0.589 |
| 199.766 | 0.587 |
| 200.774 | 0.585 |
| 201.776 | 0.583 |
| 202.776 | 0.579 |
| 203.776 | 0.575 |
| 204.776 | 0.572 |
| 205.777 | 0.568 |
| 206.78 | 0.566 |
| 207.78 | 0.564 |
| 208.781 | 0.562 |
| 209.78 | 0.561 |
| 210.78 | 0.559 |
| 211.777 | 0.556 |
| 212.772 | 0.553 |
| 213.769 | 0.549 |
| 214.764 | 0.545 |
| 215.76 | 0.542 |
| 216.754 | 0.54 |
| 217.749 | 0.538 |
| 218.745 | 0.537 |
| 219.741 | 0.535 |
| 220.74 | 0.532 |
| 221.733 | 0.529 |
| 222.727 | 0.526 |
| 223.727 | 0.522 |
| 224.724 | 0.52 |
| 225.727 | 0.517 |
| 226.725 | 0.516 |
| 227.722 | 0.514 |
| 228.722 | 0.513 |
| 229.72 | 0.511 |
| 230.721 | 0.509 |
| 231.721 | 0.506 |
| 232.72 | 0.502 |
| 233.719 | 0.499 |
| 234.719 | 0.497 |
| 235.72 | 0.495 |
| 236.72 | 0.494 |
| 237.725 | 0.493 |
| 238.728 | 0.492 |
| 239.725 | 0.489 |
| 240.724 | 0.486 |
| 241.717 | 0.483 |
| 242.716 | 0.48 |
| 243.716 | 0.477 |
| 244.716 | 0.475 |
| 245.716 | 0.474 |
| 246.717 | 0.473 |
| 247.716 | 0.472 |
| 248.718 | 0.47 |
| 249.72 | 0.468 |
| 250.725 | 0.465 |
| 251.728 | 0.462 |
| 252.731 | 0.459 |
| 253.728 | 0.456 |
| 254.73 | 0.455 |
| 255.733 | 0.454 |
| 256.734 | 0.454 |
| 257.74 | 0.453 |
| 258.738 | 0.451 |
| 259.741 | 0.448 |
| 260.741 | 0.445 |
| 261.743 | 0.442 |
| 262.743 | 0.439 |
| 263.745 | 0.437 |
| 264.739 | 0.437 |
| 265.739 | 0.436 |
| 266.736 | 0.435 |
| 267.732 | 0.434 |
| 268.728 | 0.432 |
| 269.728 | 0.43 |
| 270.725 | 0.427 |
| 271.725 | 0.424 |
| 272.722 | 0.421 |
| 273.719 | 0.42 |
| 274.722 | 0.419 |
| 275.722 | 0.419 |
| 276.724 | 0.418 |
| 277.722 | 0.417 |
| 278.72 | 0.414 |
| 279.717 | 0.412 |
| 280.722 | 0.409 |
| 281.721 | 0.406 |
| 282.72 | 0.404 |
| 283.719 | 0.403 |
| 284.718 | 0.402 |
| 285.714 | 0.401 |
| 286.714 | 0.4 |
| 287.711 | 0.399 |
| 288.711 | 0.397 |
| 289.712 | 0.394 |
| 290.712 | 0.392 |
| 291.703 | 0.389 |
| 292.699 | 0.387 |
| 293.699 | 0.387 |
| 294.698 | 0.386 |
| 295.701 | 0.386 |
| 296.696 | 0.385 |
| 297.693 | 0.383 |
| 298.694 | 0.381 |
| 299.696 | 0.379 |
| 300.696 | 0.377 |
| 301.706 | 0.375 |
| 302.713 | 0.374 |
| 303.72 | 0.373 |
| 304.728 | 0.373 |
| 305.73 | 0.372 |
| 306.733 | 0.371 |
| 307.742 | 0.37 |
| 308.748 | 0.368 |
| 309.749 | 0.366 |
| 310.75 | 0.363 |
| 311.75 | 0.362 |
| 312.751 | 0.361 |
| 313.757 | 0.36 |
| 314.759 | 0.36 |
| 315.759 | 0.36 |
| 316.763 | 0.358 |
| 317.76 | 0.357 |
| 318.751 | 0.355 |
| 319.746 | 0.353 |
| 320.742 | 0.35 |
| 321.738 | 0.348 |
| 322.737 | 0.347 |
| 323.737 | 0.346 |
| 324.733 | 0.346 |
| 325.731 | 0.346 |
| 326.732 | 0.345 |
| 327.734 | 0.344 |
| 328.738 | 0.341 |
| 329.733 | 0.339 |
| 330.733 | 0.337 |
| 331.732 | 0.335 |
| 332.73 | 0.335 |
| 333.729 | 0.334 |
| 334.732 | 0.334 |
| 335.729 | 0.334 |
| 336.729 | 0.333 |
| 337.725 | 0.332 |
| 338.722 | 0.33 |
| 339.719 | 0.328 |
| 340.721 | 0.327 |
| 341.723 | 0.325 |
| 342.724 | 0.324 |
| 343.719 | 0.324 |
| 344.716 | 0.324 |
| 345.722 | 0.324 |
| 346.722 | 0.323 |
| 347.724 | 0.322 |
| 348.727 | 0.321 |
| 349.728 | 0.319 |
| 350.728 | 0.317 |
| 351.734 | 0.316 |
| 352.738 | 0.315 |
| 353.749 | 0.315 |
| 354.753 | 0.315 |
| 355.756 | 0.315 |
| 356.755 | 0.314 |
| 357.759 | 0.314 |
| 358.761 | 0.312 |
| 359.767 | 0.31 |
| 360.764 | 0.308 |
| 361.76 | 0.307 |
| 362.754 | 0.306 |
| 363.752 | 0.306 |
| 364.752 | 0.306 |
| 365.751 | 0.306 |
| 366.754 | 0.306 |
| 367.747 | 0.305 |
| 368.745 | 0.303 |
| 369.739 | 0.302 |
| 370.736 | 0.3 |
| 371.737 | 0.299 |
| 372.739 | 0.298 |
| 373.735 | 0.298 |
| 374.732 | 0.298 |
| 375.728 | 0.298 |
| 376.731 | 0.298 |
| 377.735 | 0.298 |
| 378.746 | 0.297 |
| 379.75 | 0.295 |
| 380.75 | 0.293 |
| 381.749 | 0.291 |
| 382.747 | 0.291 |
| 383.75 | 0.291 |
| 384.747 | 0.291 |
| 385.747 | 0.292 |
| 386.749 | 0.292 |
| 387.746 | 0.292 |
| 388.741 | 0.291 |
| 389.741 | 0.289 |
| 390.74 | 0.287 |
| 391.742 | 0.286 |
| 392.747 | 0.285 |
| 393.745 | 0.285 |
| 394.74 | 0.285 |
| 395.74 | 0.286 |
| 396.742 | 0.286 |
| 397.743 | 0.287 |
| 398.747 | 0.286 |
| 399.751 | 0.284 |
| 400.756 | 0.283 |
| 401.76 | 0.281 |
| 402.763 | 0.28 |
| 403.771 | 0.28 |
| 404.781 | 0.281 |
| 405.788 | 0.282 |
| 406.798 | 0.283 |
| 407.803 | 0.284 |
| 408.803 | 0.283 |
| 409.807 | 0.282 |
| 410.807 | 0.281 |
| 411.806 | 0.279 |
| 412.802 | 0.278 |
| 413.8 | 0.278 |
| 414.799 | 0.279 |
| 415.799 | 0.281 |
| 416.796 | 0.282 |
| 417.798 | 0.282 |
| 418.798 | 0.282 |
| 419.794 | 0.28 |
| 420.786 | 0.279 |
| 421.783 | 0.277 |
| 422.776 | 0.276 |
| 423.775 | 0.276 |
| 424.773 | 0.277 |
| 425.769 | 0.278 |
| 426.763 | 0.279 |
| 427.765 | 0.28 |
| 428.766 | 0.28 |
| 429.771 | 0.279 |
| 430.772 | 0.278 |
| 431.769 | 0.276 |
| 432.766 | 0.274 |
| 433.762 | 0.274 |
| 434.757 | 0.275 |
| 435.757 | 0.276 |
| 436.761 | 0.278 |
| 437.757 | 0.279 |
| 438.755 | 0.279 |
| 439.747 | 0.279 |
| 440.742 | 0.278 |
| 441.741 | 0.276 |
| 442.746 | 0.275 |